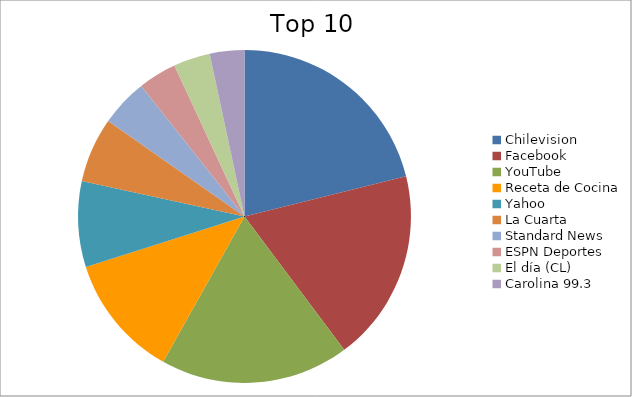
| Category | Series 0 |
|---|---|
| Chilevision | 7.36 |
| Facebook | 6.5 |
| YouTube | 6.39 |
| Receta de Cocina | 4.17 |
| Yahoo | 2.9 |
| La Cuarta | 2.2 |
| Standard News | 1.61 |
| ESPN Deportes | 1.3 |
| El día (CL) | 1.24 |
| Carolina 99.3 | 1.17 |